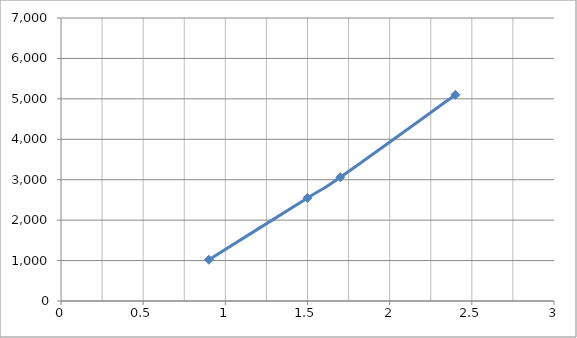
| Category | Series 0 |
|---|---|
| 0.9 | 1020 |
| 1.5 | 2550 |
| 1.7 | 3060 |
| 2.4 | 5100 |